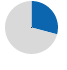
| Category | Series 0 |
|---|---|
| 0 | 217266896 |
| 1 | 528024784 |